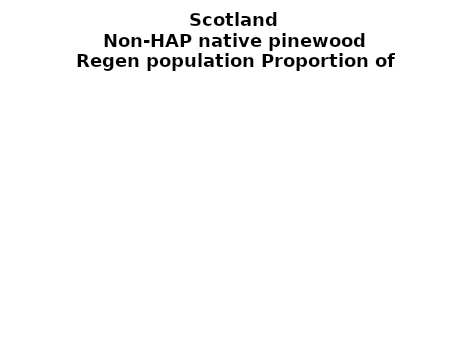
| Category | Non-HAP native pinewood |
|---|---|
| None | 0.168 |
| Seedlings only | 0.005 |
| Seedlings, saplings only | 0.123 |
| Seedlings, saplings, <7 cm trees | 0.092 |
| Saplings only | 0.129 |
| <7 cm trees, seedlings only | 0.007 |
| <7 cm trees, saplings only | 0.302 |
| <7 cm Trees only | 0.175 |